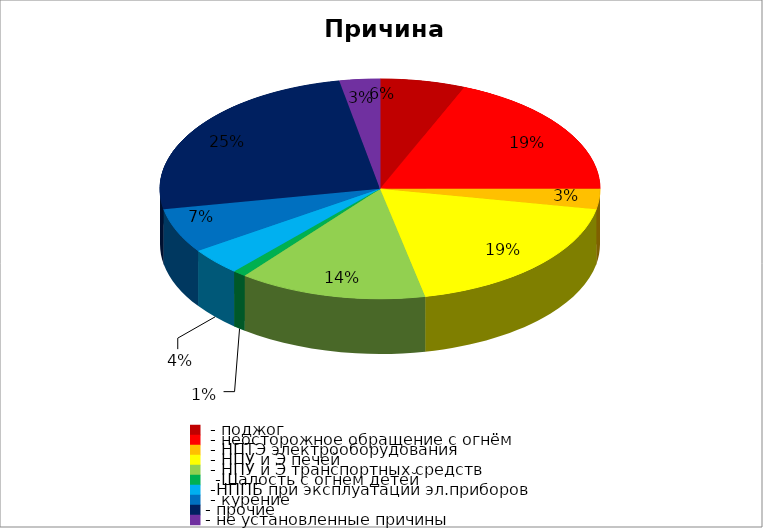
| Category | Причина пожара |
|---|---|
|  - поджог | 19 |
|  - неосторожное обращение с огнём | 57 |
|  - НПТЭ электрооборудования | 9 |
|  - НПУ и Э печей | 57 |
|  - НПУ и Э транспортных средств | 42 |
|   -Шалость с огнем детей | 3 |
|  -НППБ при эксплуатации эл.приборов | 12 |
|  - курение | 20 |
| - прочие | 76 |
| - не установленные причины | 9 |